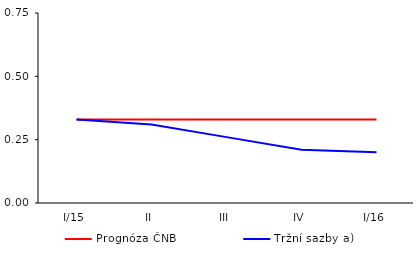
| Category | Prognóza ČNB | Tržní sazby a) |
|---|---|---|
| I/15 | 0.33 | 0.33 |
| II | 0.33 | 0.31 |
| III | 0.33 | 0.26 |
| IV | 0.33 | 0.21 |
| I/16 | 0.33 | 0.2 |